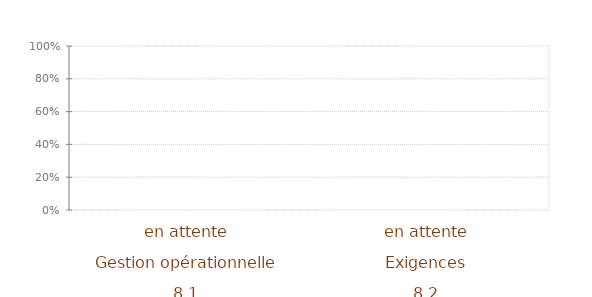
| Category | Article 8 |
|---|---|
| 0 | 0 |
| 1 | 0 |